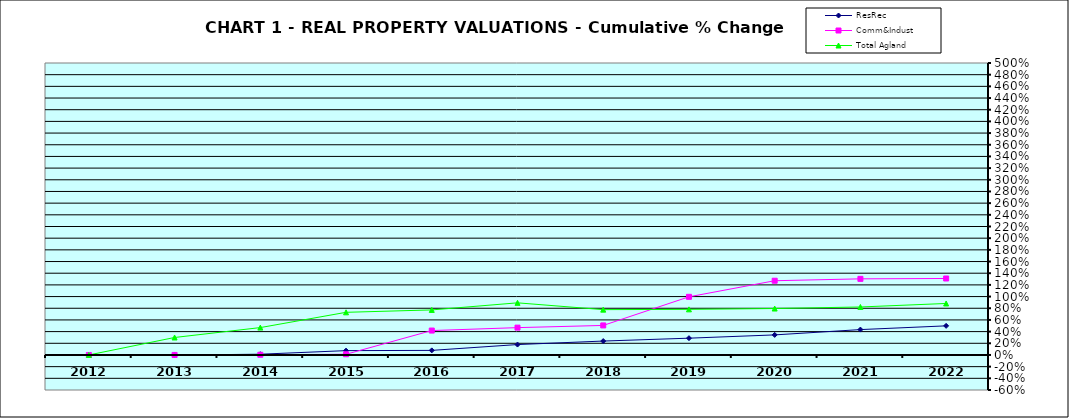
| Category | ResRec | Comm&Indust | Total Agland |
|---|---|---|---|
| 2012.0 | 0 | 0 | 0 |
| 2013.0 | -0.002 | 0.001 | 0.299 |
| 2014.0 | 0.013 | 0.004 | 0.469 |
| 2015.0 | 0.074 | 0.012 | 0.73 |
| 2016.0 | 0.079 | 0.418 | 0.771 |
| 2017.0 | 0.178 | 0.468 | 0.893 |
| 2018.0 | 0.238 | 0.506 | 0.776 |
| 2019.0 | 0.287 | 0.996 | 0.781 |
| 2020.0 | 0.344 | 1.271 | 0.795 |
| 2021.0 | 0.435 | 1.303 | 0.822 |
| 2022.0 | 0.499 | 1.31 | 0.882 |